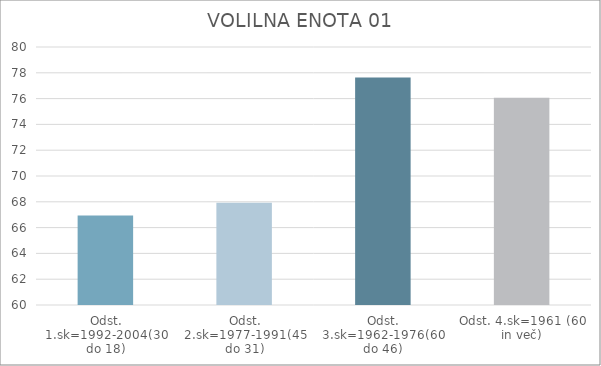
| Category | Series 0 |
|---|---|
| Odst. 1.sk=1992-2004(30 do 18) | 66.94 |
| Odst. 2.sk=1977-1991(45 do 31) | 67.93 |
| Odst. 3.sk=1962-1976(60 do 46) | 77.64 |
| Odst. 4.sk=1961 (60 in več) | 76.06 |